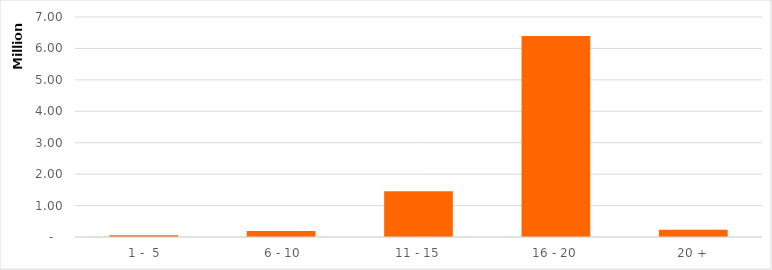
| Category | Series 0 |
|---|---|
|  1 -  5 | 56500.313 |
|  6 - 10 | 194063.762 |
| 11 - 15 | 1454036.421 |
| 16 - 20 | 6393751.947 |
| 20 + | 230564.098 |